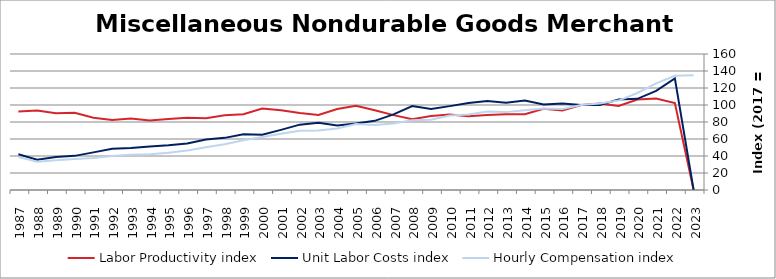
| Category | Labor Productivity index | Unit Labor Costs index | Hourly Compensation index |
|---|---|---|---|
| 2023.0 | 0 | 0 | 135.05 |
| 2022.0 | 102.331 | 131.278 | 134.338 |
| 2021.0 | 107.675 | 116.56 | 125.505 |
| 2020.0 | 106.422 | 107.244 | 114.13 |
| 2019.0 | 98.775 | 106.499 | 105.195 |
| 2018.0 | 101.647 | 100.013 | 101.66 |
| 2017.0 | 100 | 100 | 100 |
| 2016.0 | 93.634 | 101.805 | 95.324 |
| 2015.0 | 95.449 | 100.539 | 95.964 |
| 2014.0 | 89.186 | 105.207 | 93.83 |
| 2013.0 | 89.192 | 102.725 | 91.622 |
| 2012.0 | 88.103 | 104.78 | 92.315 |
| 2011.0 | 86.736 | 102.276 | 88.71 |
| 2010.0 | 88.767 | 98.664 | 87.581 |
| 2009.0 | 86.927 | 95.232 | 82.782 |
| 2008.0 | 83.141 | 98.814 | 82.155 |
| 2007.0 | 88.071 | 88.964 | 78.351 |
| 2006.0 | 93.892 | 81.349 | 76.38 |
| 2005.0 | 99.192 | 78.301 | 77.669 |
| 2004.0 | 95.364 | 75.932 | 72.412 |
| 2003.0 | 88.293 | 79.162 | 69.895 |
| 2002.0 | 90.6 | 76.889 | 69.661 |
| 2001.0 | 93.685 | 70.708 | 66.243 |
| 2000.0 | 95.774 | 65.003 | 62.256 |
| 1999.0 | 89.169 | 65.513 | 58.418 |
| 1998.0 | 87.823 | 61.328 | 53.86 |
| 1997.0 | 84.362 | 59.508 | 50.203 |
| 1996.0 | 84.89 | 54.836 | 46.55 |
| 1995.0 | 83.512 | 52.615 | 43.94 |
| 1994.0 | 81.744 | 51.289 | 41.926 |
| 1993.0 | 84.121 | 49.294 | 41.467 |
| 1992.0 | 82.413 | 48.563 | 40.022 |
| 1991.0 | 84.903 | 44.246 | 37.566 |
| 1990.0 | 90.938 | 40.158 | 36.519 |
| 1989.0 | 90.199 | 38.833 | 35.028 |
| 1988.0 | 93.585 | 35.534 | 33.254 |
| 1987.0 | 92.452 | 41.999 | 38.829 |